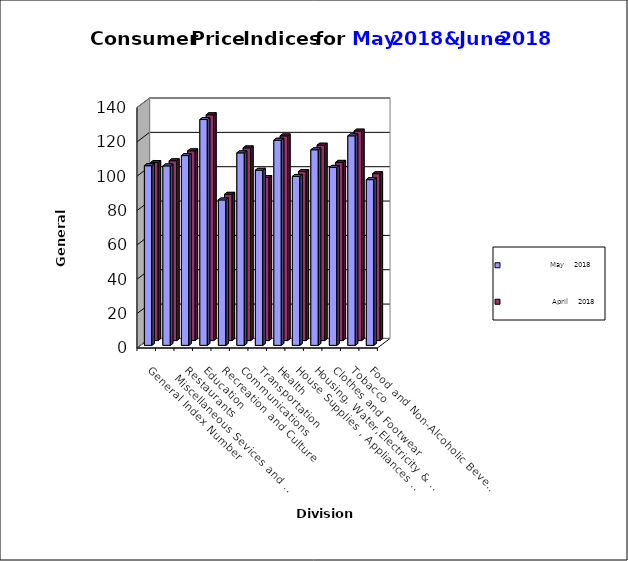
| Category |                        May     2018 |                         April     2018 |
|---|---|---|
| Food and Non-Alcoholic Beverages | 96.5 | 97.2 |
| Tobacco | 122 | 122 |
| Clothes and Footwear | 103.7 | 103.8 |
| Housing, Water,Electricity & LPG  | 113.9 | 113.8 |
| House Supplies , Appliances & Maintenance | 98.4 | 98.5 |
| Health | 119.5 | 119.2 |
| Transportation | 102 | 95 |
| Communications | 112.1 | 112.2 |
| Recreation and Culture | 84.7 | 85.2 |
| Education | 131.5 | 131.5 |
| Restaurants | 110.5 | 110.5 |
|    Miscellaneous Sevices and Goods | 104.5 | 104.7 |
| General Index Number | 104.6 | 103.7 |